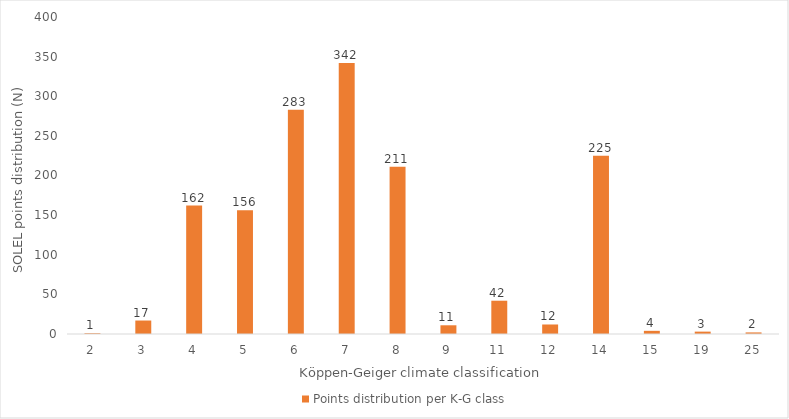
| Category | Points distribution per K-G class |
|---|---|
| 2.0 | 1 |
| 3.0 | 17 |
| 4.0 | 162 |
| 5.0 | 156 |
| 6.0 | 283 |
| 7.0 | 342 |
| 8.0 | 211 |
| 9.0 | 11 |
| 11.0 | 42 |
| 12.0 | 12 |
| 14.0 | 225 |
| 15.0 | 4 |
| 19.0 | 3 |
| 25.0 | 2 |